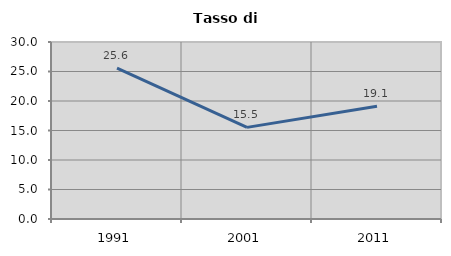
| Category | Tasso di disoccupazione   |
|---|---|
| 1991.0 | 25.556 |
| 2001.0 | 15.53 |
| 2011.0 | 19.118 |